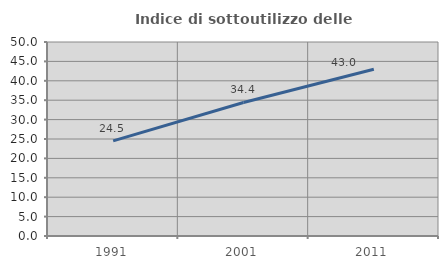
| Category | Indice di sottoutilizzo delle abitazioni  |
|---|---|
| 1991.0 | 24.511 |
| 2001.0 | 34.416 |
| 2011.0 | 42.962 |